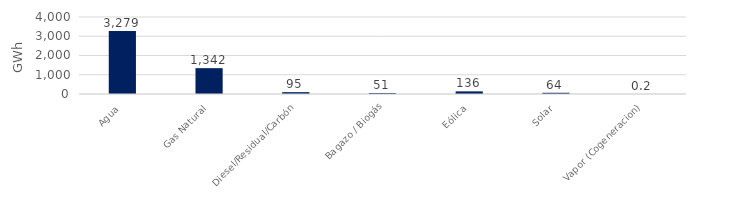
| Category | Series 0 |
|---|---|
| Agua | 3279.041 |
| Gas Natural | 1342.059 |
| Diesel/Residual/Carbón | 95.447 |
| Bagazo / Biogás | 51.097 |
| Eólica | 135.947 |
| Solar | 63.765 |
| Vapor (Cogeneracion) | 0.21 |